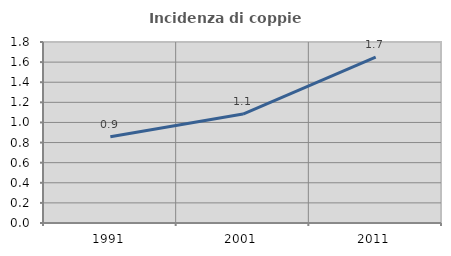
| Category | Incidenza di coppie miste |
|---|---|
| 1991.0 | 0.858 |
| 2001.0 | 1.083 |
| 2011.0 | 1.65 |